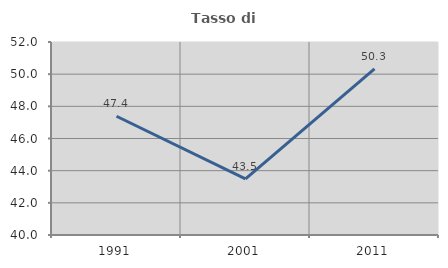
| Category | Tasso di occupazione   |
|---|---|
| 1991.0 | 47.383 |
| 2001.0 | 43.491 |
| 2011.0 | 50.329 |